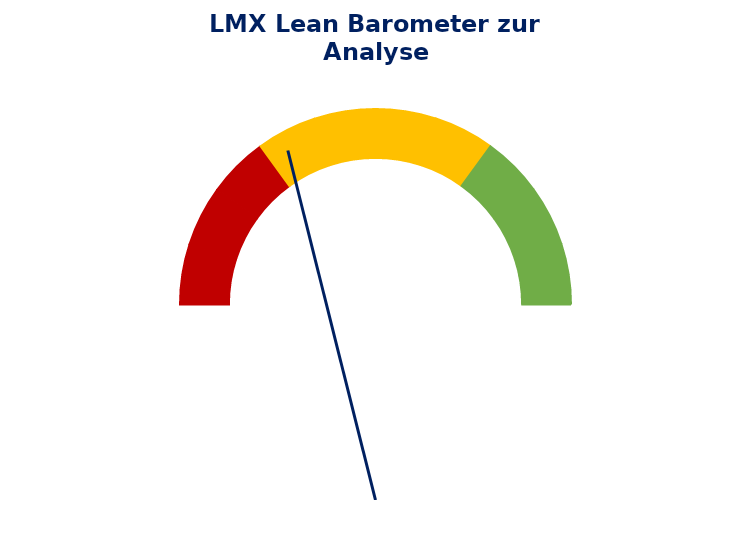
| Category | Series 0 |
|---|---|
| 0.0 | 0 |
| nan | 1 |
| 0.1 | 0 |
| nan | 1 |
| 0.2 | 0 |
| nan | 1 |
| 0.3 | 0 |
| nan | 1 |
| 0.4 | 0 |
| nan | 1 |
| 0.5 | 0 |
| nan | 1 |
| 0.6 | 0 |
| nan | 1 |
| 0.7 | 0 |
| nan | 1 |
| 0.8 | 0 |
| nan | 1 |
| 0.9 | 0 |
| nan | 1 |
| 1.0 | 0 |
| nan | 10 |